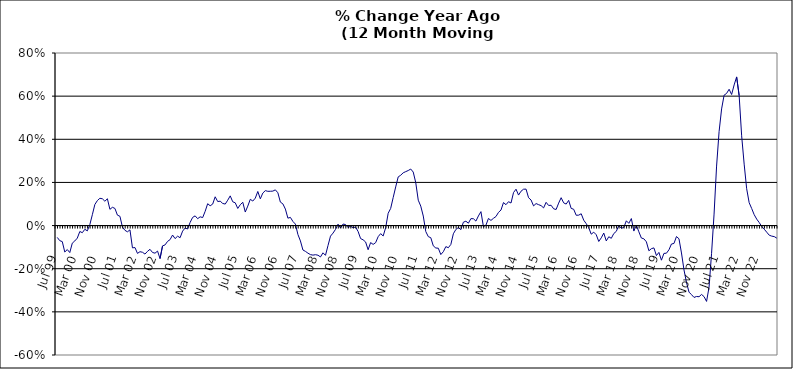
| Category | Series 0 |
|---|---|
| Jul 99 | -0.055 |
| Aug 99 | -0.07 |
| Sep 99 | -0.074 |
| Oct 99 | -0.123 |
| Nov 99 | -0.111 |
| Dec 99 | -0.125 |
| Jan 00 | -0.082 |
| Feb 00 | -0.071 |
| Mar 00 | -0.058 |
| Apr 00 | -0.027 |
| May 00 | -0.033 |
| Jun 00 | -0.017 |
| Jul 00 | -0.025 |
| Aug 00 | 0.005 |
| Sep 00 | 0.05 |
| Oct 00 | 0.098 |
| Nov 00 | 0.116 |
| Dec 00 | 0.127 |
| Jan 01 | 0.124 |
| Feb 01 | 0.113 |
| Mar 01 | 0.124 |
| Apr 01 | 0.075 |
| May 01 | 0.085 |
| Jun 01 | 0.08 |
| Jul 01 | 0.048 |
| Aug 01 | 0.043 |
| Sep 01 | -0.007 |
| Oct 01 | -0.022 |
| Nov 01 | -0.029 |
| Dec 01 | -0.02 |
| Jan 02 | -0.103 |
| Feb 02 | -0.102 |
| Mar 02 | -0.129 |
| Apr 02 | -0.121 |
| May 02 | -0.124 |
| Jun 02 | -0.132 |
| Jul 02 | -0.119 |
| Aug 02 | -0.11 |
| Sep 02 | -0.125 |
| Oct 02 | -0.128 |
| Nov 02 | -0.118 |
| Dec 02 | -0.153 |
| Jan 03 | -0.094 |
| Feb 03 | -0.09 |
| Mar 03 | -0.073 |
| Apr 03 | -0.065 |
| May 03 | -0.044 |
| Jun 03 | -0.06 |
| Jul 03 | -0.049 |
| Aug 03 | -0.056 |
| Sep 03 | -0.026 |
| Oct 03 | -0.012 |
| Nov 03 | -0.016 |
| Dec 03 | 0.014 |
| Jan 04 | 0.038 |
| Feb 04 | 0.045 |
| Mar 04 | 0.032 |
| Apr 04 | 0.041 |
| May 04 | 0.037 |
| Jun 04 | 0.066 |
| Jul 04 | 0.101 |
| Aug 04 | 0.092 |
| Sep 04 | 0.1 |
| Oct 04 | 0.133 |
| Nov 04 | 0.111 |
| Dec 04 | 0.113 |
| Jan 05 | 0.103 |
| Feb 05 | 0.1 |
| Mar 05 | 0.118 |
| Apr 05 | 0.138 |
| May 05 | 0.11 |
| Jun 05 | 0.106 |
| Jul 05 | 0.079 |
| Aug 05 | 0.097 |
| Sep 05 | 0.108 |
| Oct 05 | 0.063 |
| Nov 05 | 0.09 |
| Dec 05 | 0.122 |
| Jan 06 | 0.114 |
| Feb 06 | 0.127 |
| Mar 06 | 0.158 |
| Apr 06 | 0.124 |
| May 06 | 0.151 |
| Jun 06 | 0.162 |
| Jul 06 | 0.159 |
| Aug 06 | 0.159 |
| Sep 06 | 0.16 |
| Oct 06 | 0.166 |
| Nov 06 | 0.152 |
| Dec 06 | 0.109 |
| Jan 07 | 0.101 |
| Feb 07 | 0.076 |
| Mar 07 | 0.034 |
| Apr 07 | 0.038 |
| May 07 | 0.019 |
| Jun 07 | 0.007 |
| Jul 07 | -0.041 |
| Aug 07 | -0.071 |
| Sep 07 | -0.113 |
| Oct 07 | -0.12 |
| Nov 07 | -0.128 |
| Dec 07 | -0.135 |
| Jan 08 | -0.137 |
| Feb 08 | -0.135 |
| Mar 08 | -0.137 |
| Apr 08 | -0.145 |
| May 08 | -0.126 |
| Jun 08 | -0.138 |
| Jul 08 | -0.093 |
| Aug 08 | -0.049 |
| Sep-08 | -0.035 |
| Oct 08 | -0.018 |
| Nov 08 | 0.007 |
| Dec 08 | -0.011 |
| Jan 09 | 0.007 |
| Feb 09 | 0.005 |
| Mar 09 | -0.009 |
| Apr 09 | -0.003 |
| May 09 | -0.01 |
| Jun 09 | -0.007 |
| Jul 09 | -0.027 |
| Aug 09 | -0.06 |
| Sep 09 | -0.066 |
| Oct 09 | -0.076 |
| Nov 09 | -0.112 |
| Dec 09 | -0.079 |
| Jan 10 | -0.087 |
| Feb 10 | -0.079 |
| Mar 10 | -0.052 |
| Apr 10 | -0.037 |
| May 10 | -0.048 |
| Jun 10 | -0.01 |
| Jul 10 | 0.057 |
| Aug 10 | 0.08 |
| Sep 10 | 0.13 |
| Oct 10 | 0.179 |
| Nov 10 | 0.226 |
| Dec 10 | 0.233 |
| Jan 11 | 0.245 |
| Feb 11 | 0.25 |
| Mar 11 | 0.255 |
| Apr 11 | 0.262 |
| May 11 | 0.248 |
| Jun 11 | 0.199 |
| Jul 11 | 0.118 |
| Aug 11 | 0.09 |
| Sep 11 | 0.044 |
| Oct 11 | -0.028 |
| Nov 11 | -0.051 |
| Dec 11 | -0.056 |
| Jan 12 | -0.094 |
| Feb 12 | -0.104 |
| Mar 12 | -0.105 |
| Apr 12 | -0.134 |
| May 12 | -0.121 |
| Jun 12 | -0.098 |
| Jul 12 | -0.103 |
| Aug 12 | -0.087 |
| Sep 12 | -0.038 |
| Oct 12 | -0.018 |
| Nov 12 | -0.009 |
| Dec 12 | -0.019 |
| Jan 13 | 0.016 |
| Feb-13 | 0.02 |
| Mar-13 | 0.011 |
| Apr 13 | 0.032 |
| May 13 | 0.032 |
| Jun-13 | 0.021 |
| Jul 13 | 0.045 |
| Aug 13 | 0.065 |
| Sep 13 | -0.005 |
| Oct 13 | 0.002 |
| Nov 13 | 0.033 |
| Dec 13 | 0.024 |
| Jan 14 | 0.034 |
| Feb-14 | 0.042 |
| Mar 14 | 0.061 |
| Apr 14 | 0.072 |
| May 14 | 0.107 |
| Jun 14 | 0.097 |
| Jul-14 | 0.111 |
| Aug-14 | 0.105 |
| Sep 14 | 0.153 |
| Oct 14 | 0.169 |
| Nov 14 | 0.141 |
| Dec 14 | 0.159 |
| Jan 15 | 0.169 |
| Feb 15 | 0.169 |
| Mar 15 | 0.129 |
| Apr-15 | 0.118 |
| May 15 | 0.091 |
| Jun-15 | 0.102 |
| Jul 15 | 0.097 |
| Aug 15 | 0.092 |
| Sep 15 | 0.082 |
| Oct 15 | 0.108 |
| Nov 15 | 0.093 |
| Dec 15 | 0.094 |
| Jan 16 | 0.078 |
| Feb 16 | 0.075 |
| Mar 16 | 0.104 |
| Apr 16 | 0.129 |
| May 16 | 0.105 |
| Jun 16 | 0.1 |
| Jul 16 | 0.117 |
| Aug 16 | 0.08 |
| Sep 16 | 0.076 |
| Oct 16 | 0.048 |
| Nov 16 | 0.048 |
| Dec 16 | 0.055 |
| Jan 17 | 0.025 |
| Feb 17 | 0.009 |
| Mar 17 | -0.01 |
| Apr 17 | -0.04 |
| May 17 | -0.031 |
| Jun 17 | -0.042 |
| Jul 17 | -0.074 |
| Aug 17 | -0.057 |
| Sep 17 | -0.035 |
| Oct 17 | -0.071 |
| Nov 17 | -0.052 |
| Dec 17 | -0.059 |
| Jan 18 | -0.037 |
| Feb 18 | -0.027 |
| Mar 18 | 0 |
| Apr 18 | -0.012 |
| May 18 | -0.009 |
| Jun 18 | 0.022 |
| Jul 18 | 0.01 |
| Aug 18 | 0.033 |
| Sep 18 | -0.025 |
| Oct 18 | 0.002 |
| Nov 18 | -0.029 |
| Dec 18 | -0.058 |
| Jan 19 | -0.061 |
| Feb 19 | -0.075 |
| Mar 19 | -0.117 |
| Apr 19 | -0.107 |
| May 19 | -0.104 |
| Jun 19 | -0.139 |
| Jul 19 | -0.124 |
| Aug 19 | -0.16 |
| Sep 19 | -0.129 |
| Oct 19 | -0.128 |
| Nov 19 | -0.112 |
| Dec 19 | -0.085 |
| Jan 20 | -0.083 |
| Feb 20 | -0.051 |
| Mar 20 | -0.061 |
| Apr 20 | -0.127 |
| May 20 | -0.206 |
| Jun 20 | -0.264 |
| Jul 20 | -0.308 |
| Aug 20 | -0.32 |
| Sep 20 | -0.333 |
| Oct 20 | -0.329 |
| Nov 20 | -0.33 |
| Dec 20 | -0.319 |
| Jan 21 | -0.329 |
| Feb 21 | -0.352 |
| Mar 21 | -0.286 |
| Apr 21 | -0.129 |
| May 21 | 0.053 |
| Jun 21 | 0.276 |
| Jul 21 | 0.435 |
| Aug 21 | 0.541 |
| Sep 21 | 0.604 |
| Oct 21 | 0.613 |
| Nov 21 | 0.632 |
| Dec 21 | 0.608 |
| Jan 22 | 0.652 |
| Feb 22 | 0.689 |
| Mar 22 | 0.603 |
| Apr 22 | 0.416 |
| May 22 | 0.285 |
| Jun 22 | 0.171 |
| Jul 22 | 0.106 |
| Aug 22 | 0.079 |
| Sep 22 | 0.051 |
| Oct 22 | 0.03 |
| Nov 22 | 0.014 |
| Dec 22 | -0.004 |
| Jan 23 | -0.017 |
| Feb 23 | -0.031 |
| Mar 23 | -0.045 |
| Apr 23 | -0.049 |
| May 23 | -0.051 |
| Jun 23 | -0.058 |